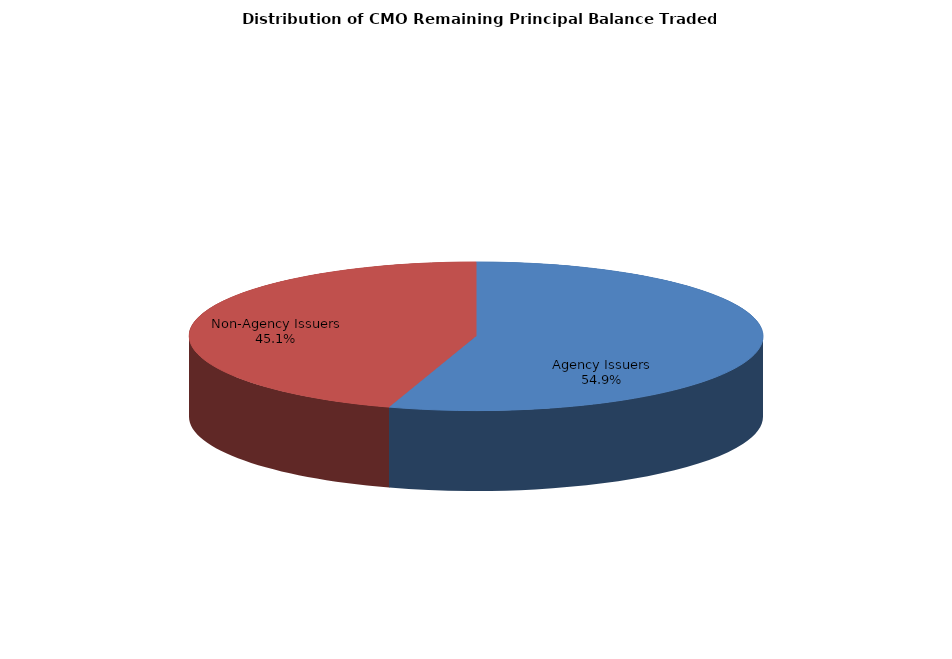
| Category | Series 0 |
|---|---|
| Agency Issuers | 3376660470.089 |
| Non-Agency Issuers | 2775052219.365 |